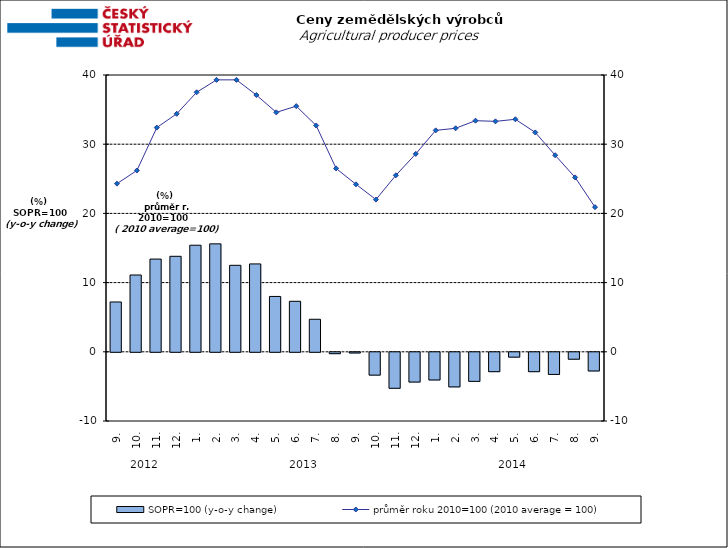
| Category | SOPR=100 (y-o-y change)   |
|---|---|
| 0 | 7.2 |
| 1 | 11.1 |
| 2 | 13.4 |
| 3 | 13.8 |
| 4 | 15.4 |
| 5 | 15.6 |
| 6 | 12.5 |
| 7 | 12.7 |
| 8 | 8 |
| 9 | 7.3 |
| 10 | 4.7 |
| 11 | -0.2 |
| 12 | -0.1 |
| 13 | -3.3 |
| 14 | -5.2 |
| 15 | -4.3 |
| 16 | -4 |
| 17 | -5 |
| 18 | -4.2 |
| 19 | -2.8 |
| 20 | -0.7 |
| 21 | -2.8 |
| 22 | -3.2 |
| 23 | -1 |
| 24 | -2.7 |